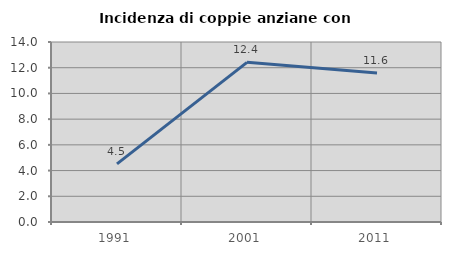
| Category | Incidenza di coppie anziane con figli |
|---|---|
| 1991.0 | 4.516 |
| 2001.0 | 12.418 |
| 2011.0 | 11.594 |